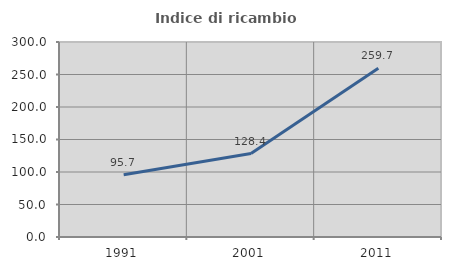
| Category | Indice di ricambio occupazionale  |
|---|---|
| 1991.0 | 95.695 |
| 2001.0 | 128.37 |
| 2011.0 | 259.748 |